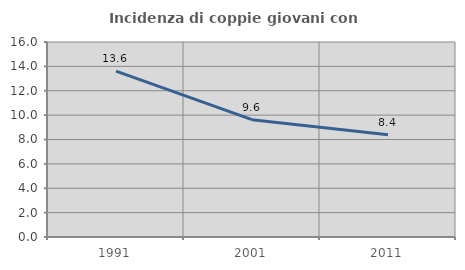
| Category | Incidenza di coppie giovani con figli |
|---|---|
| 1991.0 | 13.616 |
| 2001.0 | 9.627 |
| 2011.0 | 8.396 |